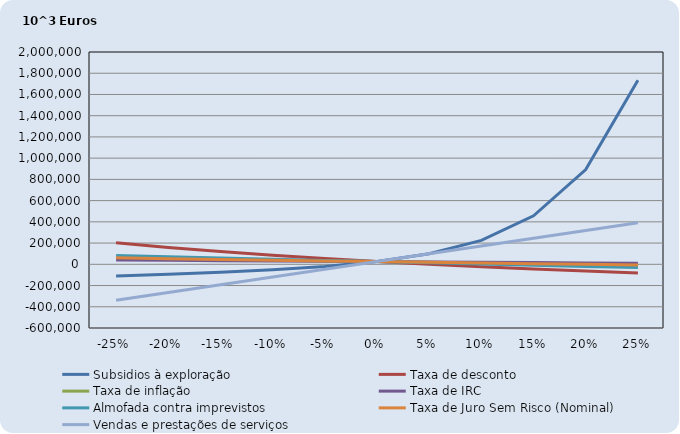
| Category | Subsidios à exploração | Taxa de desconto | Taxa de inflação | Taxa de IRC | Almofada contra imprevistos | Taxa de Juro Sem Risco (Nominal) | Vendas e prestações de serviços |
|---|---|---|---|---|---|---|---|
| -0.25 | -110121.311 | 202935.686 | 56045.703 | 39943.576 | 82037.95 | 60706.483 | -339579.845 |
| -0.2 | -94282.378 | 159399.198 | 50215.955 | 37131.502 | 70720.631 | 53293.143 | -266573.605 |
| -0.15 | -75576.888 | 120388.305 | 44234.46 | 34277.604 | 59403.312 | 46066.329 | -193567.365 |
| -0.1 | -52178.652 | 85361.73 | 38097.354 | 31380.549 | 48085.993 | 39020.581 | -120561.125 |
| -0.05 | -20684.815 | 53851.351 | 31800.665 | 28438.949 | 36768.674 | 32150.623 | -47554.885 |
| 0.0 | 25451.355 | 25451.355 | 25451.355 | 25451.355 | 25451.355 | 25451.355 | 25451.355 |
| 0.05 | 99098.055 | -190.889 | 18712.082 | 22416.257 | 14134.036 | 18917.85 | 98457.595 |
| 0.1 | 225838.157 | -23382.514 | 11911.672 | 19332.077 | 2816.717 | 12545.343 | 171463.835 |
| 0.15 | 456679.61 | -44391.636 | 4934.638 | 16197.171 | -8500.602 | 6329.228 | 244470.075 |
| 0.2 | 892956.457 | -63452.845 | -2223.587 | 13009.823 | -19817.921 | 265.051 | 317476.315 |
| 0.25 | 1734320.982 | -80771.856 | -9567.696 | 9768.239 | -31135.24 | -5651.496 | 390482.555 |